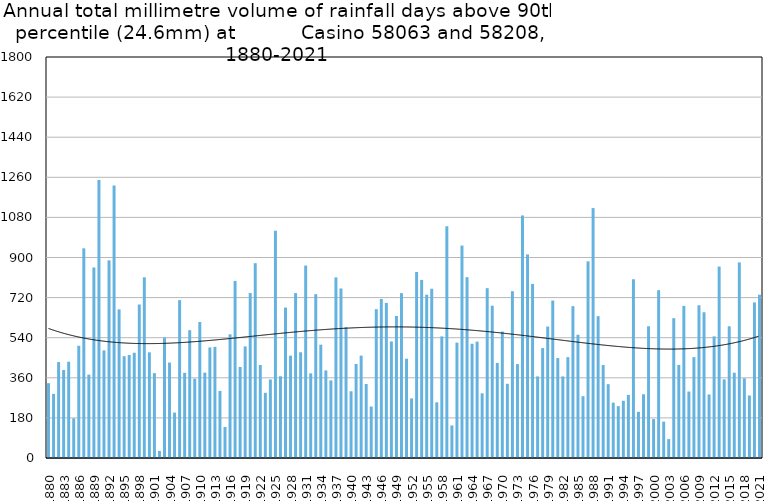
| Category | Annual total mm in days above 90th percentile |
|---|---|
| 1880 | 335.8 |
| 1881 | 287.9 |
| 1882 | 430.6 |
| 1883 | 395.2 |
| 1884 | 432.1 |
| 1885 | 178.1 |
| 1886 | 503.8 |
| 1887 | 941.2 |
| 1888 | 374.1 |
| 1889 | 855.2 |
| 1890 | 1247.8 |
| 1891 | 483 |
| 1892 | 887 |
| 1893 | 1223.4 |
| 1894 | 667.1 |
| 1895 | 456.9 |
| 1896 | 462.3 |
| 1897 | 472.4 |
| 1898 | 689 |
| 1899 | 811.1 |
| 1900 | 474.3 |
| 1901 | 380.9 |
| 1902 | 31.8 |
| 1903 | 540.4 |
| 1904 | 428.3 |
| 1905 | 203.8 |
| 1906 | 708.7 |
| 1907 | 382.2 |
| 1908 | 573.8 |
| 1909 | 356.1 |
| 1910 | 610.6 |
| 1911 | 383.1 |
| 1912 | 496.4 |
| 1913 | 498.9 |
| 1914 | 301 |
| 1915 | 139.5 |
| 1916 | 555.1 |
| 1917 | 794.9 |
| 1918 | 408.8 |
| 1919 | 500.9 |
| 1920 | 740.5 |
| 1921 | 874.5 |
| 1922 | 417.4 |
| 1923 | 292.6 |
| 1924 | 352.3 |
| 1925 | 1020.2 |
| 1926 | 366.9 |
| 1927 | 675.2 |
| 1928 | 459.4 |
| 1929 | 740.2 |
| 1930 | 474.6 |
| 1931 | 863.9 |
| 1932 | 380 |
| 1933 | 735.3 |
| 1934 | 508.7 |
| 1935 | 393.1 |
| 1936 | 348.3 |
| 1937 | 810.7 |
| 1938 | 761 |
| 1939 | 587.4 |
| 1940 | 299.5 |
| 1941 | 422.1 |
| 1942 | 459.6 |
| 1943 | 332 |
| 1944 | 231.1 |
| 1945 | 668.1 |
| 1946 | 714 |
| 1947 | 696.1 |
| 1948 | 523.2 |
| 1949 | 637.6 |
| 1950 | 739.9 |
| 1951 | 445.5 |
| 1952 | 267.5 |
| 1953 | 835.1 |
| 1954 | 799.5 |
| 1955 | 733 |
| 1956 | 759.8 |
| 1957 | 250 |
| 1958 | 545.9 |
| 1959 | 1040.3 |
| 1960 | 146.1 |
| 1961 | 517.8 |
| 1962 | 953.6 |
| 1963 | 811.6 |
| 1964 | 512.8 |
| 1965 | 522.5 |
| 1966 | 290.3 |
| 1967 | 762.3 |
| 1968 | 683.6 |
| 1969 | 427 |
| 1970 | 567.5 |
| 1971 | 333 |
| 1972 | 748.8 |
| 1973 | 421.5 |
| 1974 | 1088.8 |
| 1975 | 914 |
| 1976 | 781.6 |
| 1977 | 366.3 |
| 1978 | 493.3 |
| 1979 | 590 |
| 1980 | 706.8 |
| 1981 | 448.6 |
| 1982 | 366.2 |
| 1983 | 452.8 |
| 1984 | 681.5 |
| 1985 | 553.2 |
| 1986 | 277.6 |
| 1987 | 882.8 |
| 1988 | 1121.8 |
| 1989 | 636.7 |
| 1990 | 417.4 |
| 1991 | 331.4 |
| 1992 | 248.4 |
| 1993 | 232.8 |
| 1994 | 256.8 |
| 1995 | 283.4 |
| 1996 | 802.4 |
| 1997 | 207.4 |
| 1998 | 286.2 |
| 1999 | 591.4 |
| 2000 | 174.7 |
| 2001 | 753.4 |
| 2002 | 163.2 |
| 2003 | 84.8 |
| 2004 | 627.6 |
| 2005 | 418 |
| 2006 | 683 |
| 2007 | 298.4 |
| 2008 | 452.6 |
| 2009 | 685.6 |
| 2010 | 654.2 |
| 2011 | 285 |
| 2012 | 546 |
| 2013 | 859.4 |
| 2014 | 353 |
| 2015 | 591.2 |
| 2016 | 382.8 |
| 2017 | 878 |
| 2018 | 357.8 |
| 2019 | 280.6 |
| 2020 | 698.4 |
| 2021 | 732.8 |